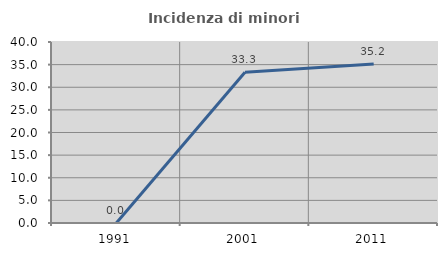
| Category | Incidenza di minori stranieri |
|---|---|
| 1991.0 | 0 |
| 2001.0 | 33.333 |
| 2011.0 | 35.156 |